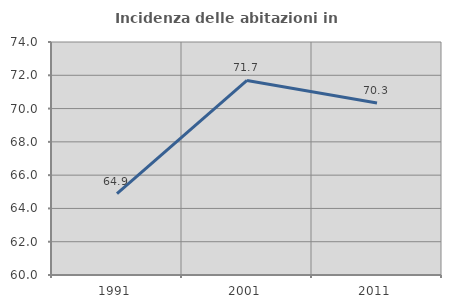
| Category | Incidenza delle abitazioni in proprietà  |
|---|---|
| 1991.0 | 64.889 |
| 2001.0 | 71.689 |
| 2011.0 | 70.335 |